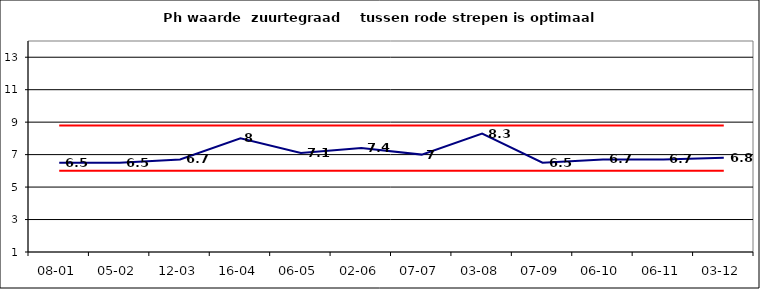
| Category | Series 0 | Series 1 | Series 2 |
|---|---|---|---|
| 08-01 | 6.5 | 6 | 8.8 |
| 05-02 | 6.5 | 6 | 8.8 |
| 12-03 | 6.7 | 6 | 8.8 |
| 16-04 | 8 | 6 | 8.8 |
| 06-05 | 7.1 | 6 | 8.8 |
| 02-06 | 7.4 | 6 | 8.8 |
| 07-07 | 7 | 6 | 8.8 |
| 03-08 | 8.3 | 6 | 8.8 |
| 07-09 | 6.5 | 6 | 8.8 |
| 06-10 | 6.7 | 6 | 8.8 |
| 06-11 | 6.7 | 6 | 8.8 |
| 03-12 | 6.8 | 6 | 8.8 |